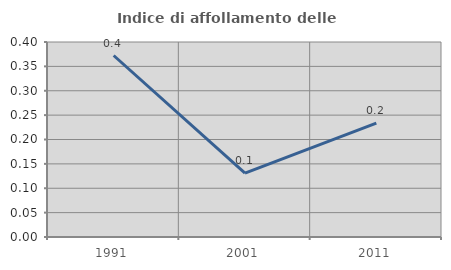
| Category | Indice di affollamento delle abitazioni  |
|---|---|
| 1991.0 | 0.372 |
| 2001.0 | 0.131 |
| 2011.0 | 0.234 |